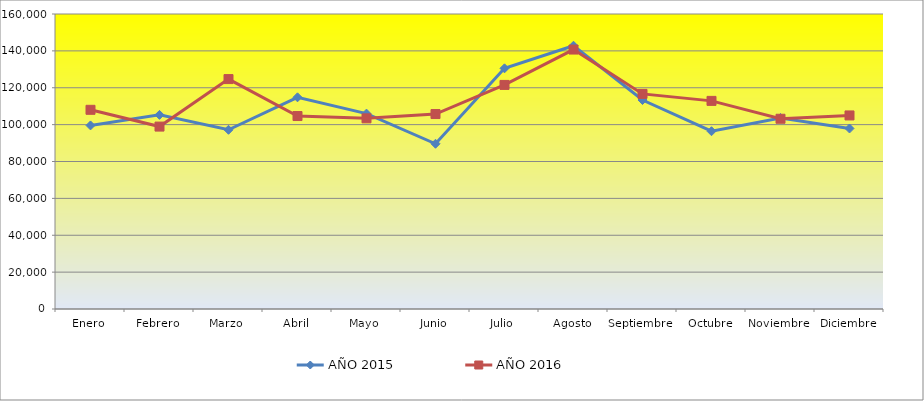
| Category | AÑO 2015 | AÑO 2016 |
|---|---|---|
| Enero | 99560 | 108040 |
| Febrero | 105280 | 98940 |
| Marzo | 97200 | 124700 |
| Abril | 114820 | 104660 |
| Mayo | 105980 | 103400 |
| Junio | 89620 | 105740 |
| Julio | 130540 | 121540 |
| Agosto | 142780 | 140720 |
| Septiembre | 113340 | 116660 |
| Octubre | 96420 | 112880 |
| Noviembre | 103600 | 103180 |
| Diciembre | 97900 | 104980 |